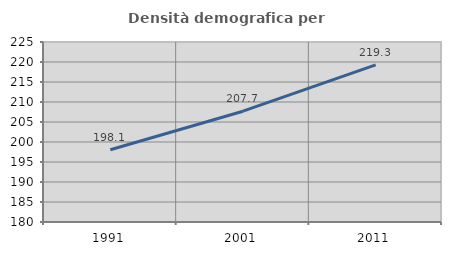
| Category | Densità demografica |
|---|---|
| 1991.0 | 198.056 |
| 2001.0 | 207.7 |
| 2011.0 | 219.294 |